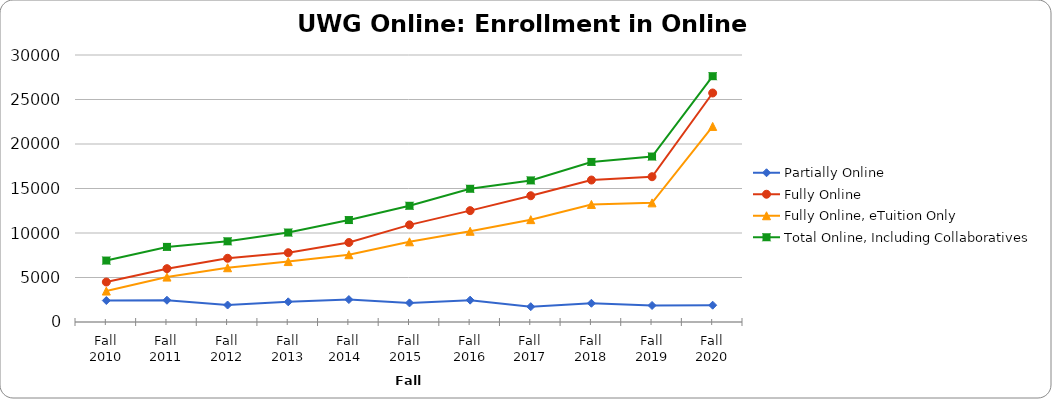
| Category | Partially Online | Fully Online | Fully Online, eTuition Only | Total Online, Including Collaboratives |
|---|---|---|---|---|
| Fall 2010 | 2412 | 4492 | 3477 | 6904 |
| Fall 2011 | 2445 | 5993 | 5046 | 8438 |
| Fall 2012 | 1908 | 7159 | 6096 | 9067 |
| Fall 2013 | 2267 | 7784 | 6790 | 10051 |
| Fall 2014  | 2522 | 8933 | 7560 | 11455 |
| Fall 2015  | 2145 | 10913 | 9011 | 13058 |
| Fall 2016 | 2456 | 12513 | 10194 | 14969 |
| Fall 2017 | 1722 | 14186 | 11500 | 15908 |
| Fall 2018 | 2104 | 15951 | 13210 | 17985 |
| Fall 2019 | 1856 | 16322 | 13386 | 18593 |
| Fall 2020 | 1888 | 25731 | 21975 | 27619 |